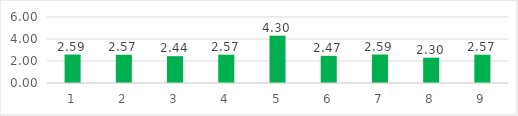
| Category | Series 0 |
|---|---|
| 0 | 2.59 |
| 1 | 2.57 |
| 2 | 2.44 |
| 3 | 2.57 |
| 4 | 4.3 |
| 5 | 2.47 |
| 6 | 2.59 |
| 7 | 2.3 |
| 8 | 2.57 |